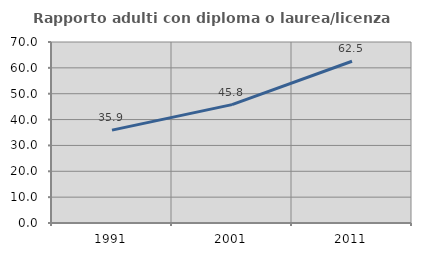
| Category | Rapporto adulti con diploma o laurea/licenza media  |
|---|---|
| 1991.0 | 35.925 |
| 2001.0 | 45.779 |
| 2011.0 | 62.548 |